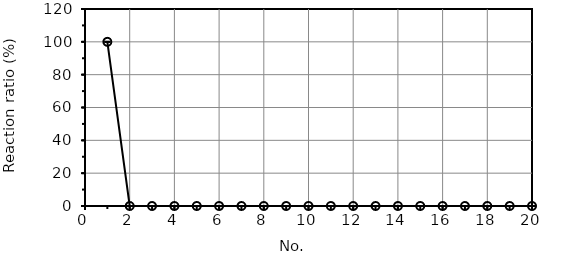
| Category | 01 protected-Alphatomega (S) |
|---|---|
| 1.0 | 100 |
| 2.0 | 0 |
| 3.0 | 0 |
| 4.0 | 0 |
| 5.0 | 0 |
| 6.0 | 0 |
| 7.0 | 0 |
| 8.0 | 0 |
| 9.0 | 0 |
| 10.0 | 0 |
| 11.0 | 0 |
| 12.0 | 0 |
| 13.0 | 0 |
| 14.0 | 0 |
| 15.0 | 0 |
| 16.0 | 0 |
| 17.0 | 0 |
| 18.0 | 0 |
| 19.0 | 0 |
| 20.0 | 0 |